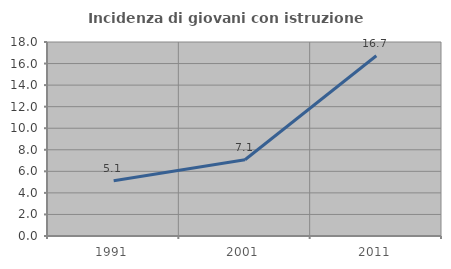
| Category | Incidenza di giovani con istruzione universitaria |
|---|---|
| 1991.0 | 5.128 |
| 2001.0 | 7.077 |
| 2011.0 | 16.726 |